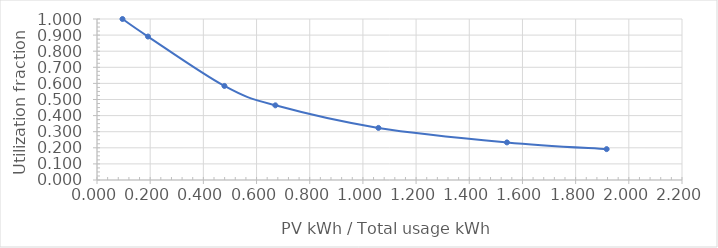
| Category | Onsite utilization fraction (coincident production-and-use) |
|---|---|
| 0.09583333333333334 | 1 |
| 0.19166666666666668 | 0.891 |
| 0.4791666666666667 | 0.584 |
| 0.6708333333333333 | 0.464 |
| 1.0583333333333333 | 0.324 |
| 1.5416666666666667 | 0.234 |
| 1.9166666666666667 | 0.192 |